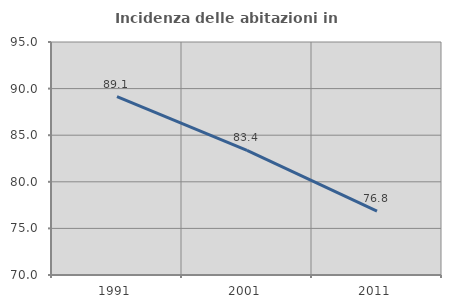
| Category | Incidenza delle abitazioni in proprietà  |
|---|---|
| 1991.0 | 89.145 |
| 2001.0 | 83.377 |
| 2011.0 | 76.842 |